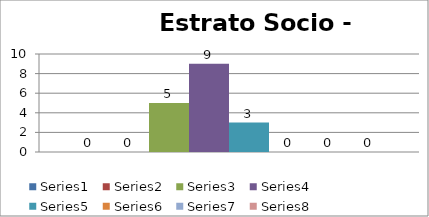
| Category | Series 0 | Series 1 | Series 2 | Series 3 | Series 4 | Series 5 | Series 6 | Series 7 |
|---|---|---|---|---|---|---|---|---|
| 0 | 0 | 0 | 5 | 9 | 3 | 0 | 0 | 0 |